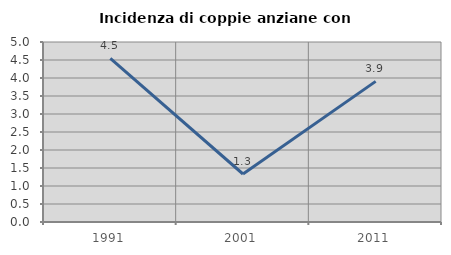
| Category | Incidenza di coppie anziane con figli |
|---|---|
| 1991.0 | 4.545 |
| 2001.0 | 1.333 |
| 2011.0 | 3.906 |